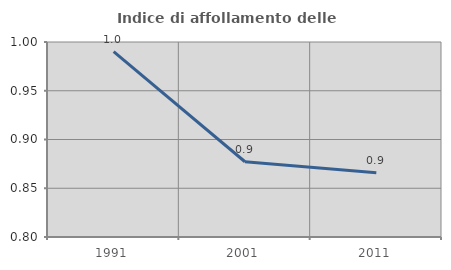
| Category | Indice di affollamento delle abitazioni  |
|---|---|
| 1991.0 | 0.99 |
| 2001.0 | 0.877 |
| 2011.0 | 0.866 |